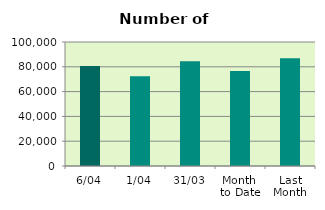
| Category | Series 0 |
|---|---|
| 6/04 | 80664 |
| 1/04 | 72406 |
| 31/03 | 84432 |
| Month 
to Date | 76535 |
| Last
Month | 86968.783 |